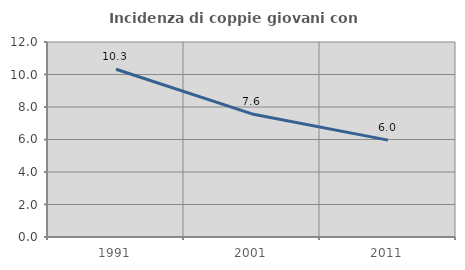
| Category | Incidenza di coppie giovani con figli |
|---|---|
| 1991.0 | 10.32 |
| 2001.0 | 7.573 |
| 2011.0 | 5.96 |